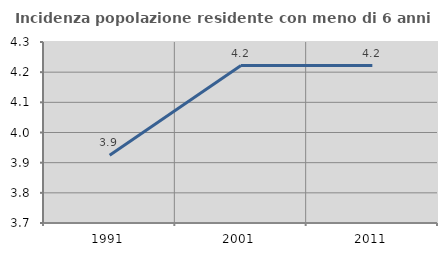
| Category | Incidenza popolazione residente con meno di 6 anni |
|---|---|
| 1991.0 | 3.925 |
| 2001.0 | 4.222 |
| 2011.0 | 4.222 |